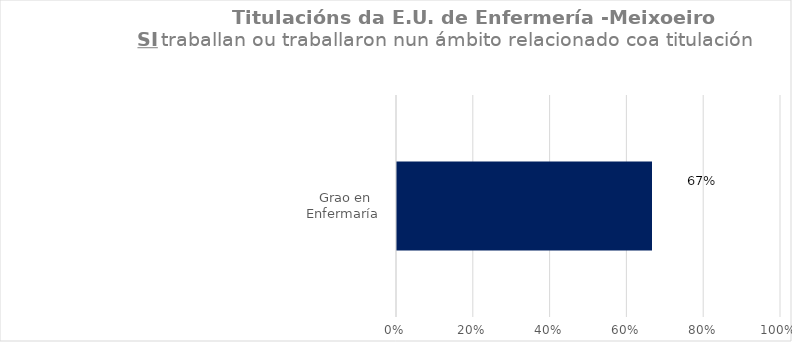
| Category | Series 1 |
|---|---|
| Grao en Enfermaría  | 0.667 |